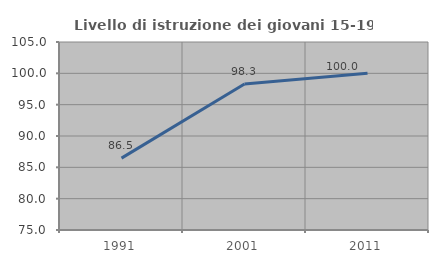
| Category | Livello di istruzione dei giovani 15-19 anni |
|---|---|
| 1991.0 | 86.466 |
| 2001.0 | 98.305 |
| 2011.0 | 100 |